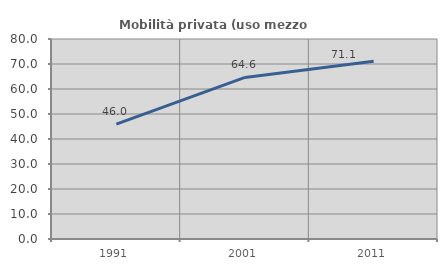
| Category | Mobilità privata (uso mezzo privato) |
|---|---|
| 1991.0 | 45.983 |
| 2001.0 | 64.638 |
| 2011.0 | 71.098 |